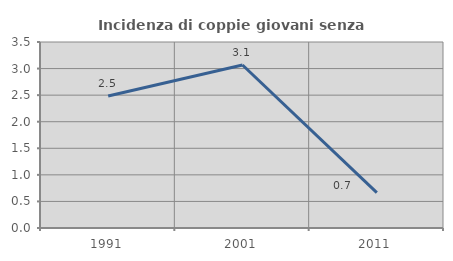
| Category | Incidenza di coppie giovani senza figli |
|---|---|
| 1991.0 | 2.484 |
| 2001.0 | 3.067 |
| 2011.0 | 0.667 |